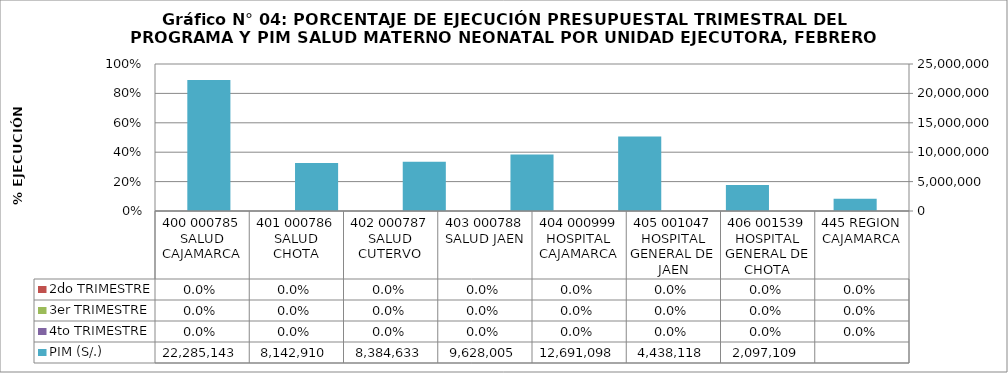
| Category | 2do TRIMESTRE | 3er TRIMESTRE | 4to TRIMESTRE |
|---|---|---|---|
| 400 000785 SALUD CAJAMARCA | 0 | 0 | 0 |
| 401 000786 SALUD CHOTA | 0 | 0 | 0 |
| 402 000787 SALUD CUTERVO | 0 | 0 | 0 |
| 403 000788 SALUD JAEN | 0 | 0 | 0 |
| 404 000999 HOSPITAL CAJAMARCA | 0 | 0 | 0 |
| 405 001047 HOSPITAL GENERAL DE JAEN | 0 | 0 | 0 |
| 406 001539 HOSPITAL GENERAL DE CHOTA | 0 | 0 | 0 |
| 445 REGION CAJAMARCA | 0 | 0 | 0 |